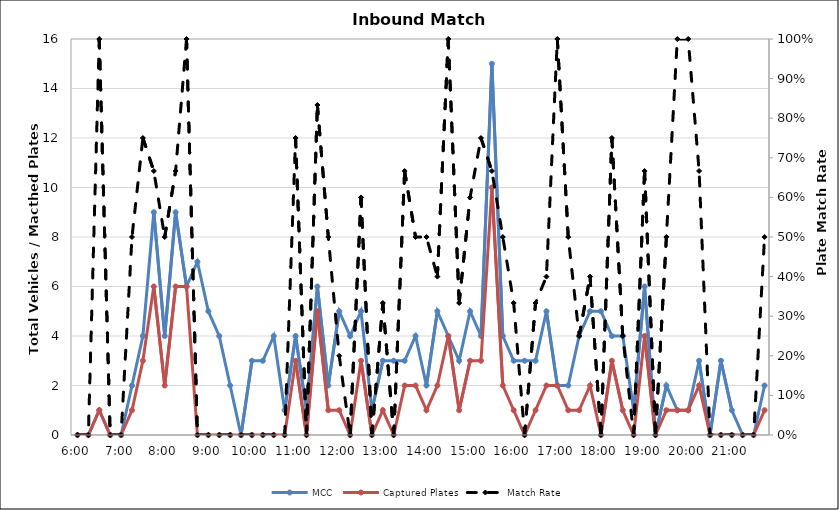
| Category | MCC | Captured Plates |
|---|---|---|
| 0.25 | 0 | 0 |
| 0.260416666666667 | 0 | 0 |
| 0.270833333333333 | 1 | 1 |
| 0.28125 | 0 | 0 |
| 0.291666666666667 | 0 | 0 |
| 0.302083333333333 | 2 | 1 |
| 0.3125 | 4 | 3 |
| 0.322916666666667 | 9 | 6 |
| 0.333333333333333 | 4 | 2 |
| 0.34375 | 9 | 6 |
| 0.354166666666667 | 6 | 6 |
| 0.364583333333333 | 7 | 0 |
| 0.375 | 5 | 0 |
| 0.385416666666667 | 4 | 0 |
| 0.395833333333333 | 2 | 0 |
| 0.40625 | 0 | 0 |
| 0.416666666666667 | 3 | 0 |
| 0.427083333333333 | 3 | 0 |
| 0.4375 | 4 | 0 |
| 0.447916666666667 | 1 | 0 |
| 0.458333333333333 | 4 | 3 |
| 0.46875 | 1 | 0 |
| 0.479166666666667 | 6 | 5 |
| 0.489583333333333 | 2 | 1 |
| 0.5 | 5 | 1 |
| 0.510416666666667 | 4 | 0 |
| 0.520833333333333 | 5 | 3 |
| 0.53125 | 1 | 0 |
| 0.541666666666667 | 3 | 1 |
| 0.552083333333333 | 3 | 0 |
| 0.5625 | 3 | 2 |
| 0.572916666666667 | 4 | 2 |
| 0.583333333333333 | 2 | 1 |
| 0.59375 | 5 | 2 |
| 0.604166666666667 | 4 | 4 |
| 0.614583333333333 | 3 | 1 |
| 0.625 | 5 | 3 |
| 0.635416666666667 | 4 | 3 |
| 0.645833333333333 | 15 | 10 |
| 0.65625 | 4 | 2 |
| 0.666666666666667 | 3 | 1 |
| 0.677083333333333 | 3 | 0 |
| 0.6875 | 3 | 1 |
| 0.697916666666667 | 5 | 2 |
| 0.708333333333333 | 2 | 2 |
| 0.71875 | 2 | 1 |
| 0.729166666666667 | 4 | 1 |
| 0.739583333333333 | 5 | 2 |
| 0.75 | 5 | 0 |
| 0.760416666666667 | 4 | 3 |
| 0.770833333333333 | 4 | 1 |
| 0.78125 | 1 | 0 |
| 0.791666666666667 | 6 | 4 |
| 0.802083333333333 | 0 | 0 |
| 0.8125 | 2 | 1 |
| 0.822916666666667 | 1 | 1 |
| 0.833333333333333 | 1 | 1 |
| 0.84375 | 3 | 2 |
| 0.854166666666667 | 0 | 0 |
| 0.864583333333333 | 3 | 0 |
| 0.875 | 1 | 0 |
| 0.885416666666667 | 0 | 0 |
| 0.895833333333333 | 0 | 0 |
| 0.90625 | 2 | 1 |